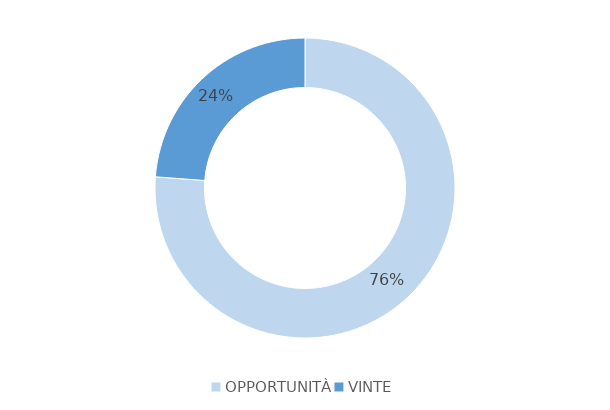
| Category | Series 0 |
|---|---|
| OPPORTUNITÀ | 16 |
| VINTE | 5 |